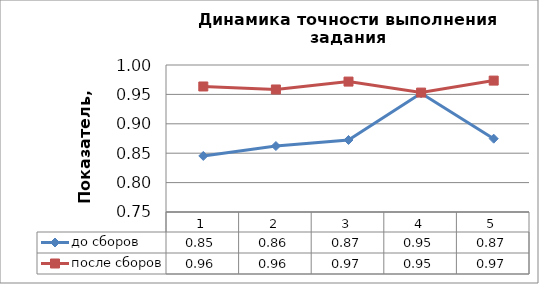
| Category | до сборов | после сборов |
|---|---|---|
| 0 | 0.845 | 0.963 |
| 1 | 0.862 | 0.958 |
| 2 | 0.872 | 0.972 |
| 3 | 0.952 | 0.953 |
| 4 | 0.875 | 0.973 |